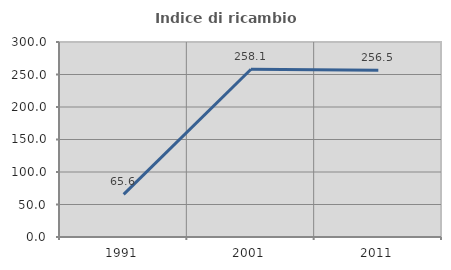
| Category | Indice di ricambio occupazionale  |
|---|---|
| 1991.0 | 65.625 |
| 2001.0 | 258.065 |
| 2011.0 | 256.522 |